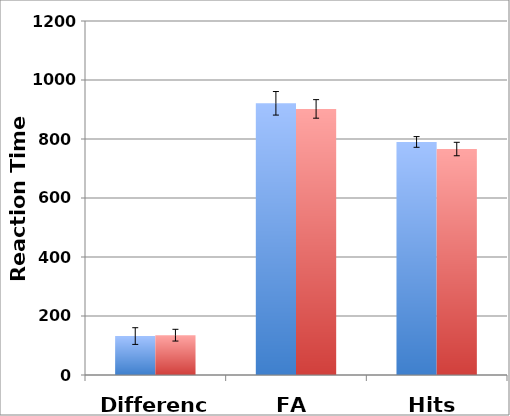
| Category | Low Unusual Experiences Score | High Unusual Experiences Score |
|---|---|---|
| Difference | 132 | 135 |
| FA | 921 | 902 |
| Hits | 790 | 766 |